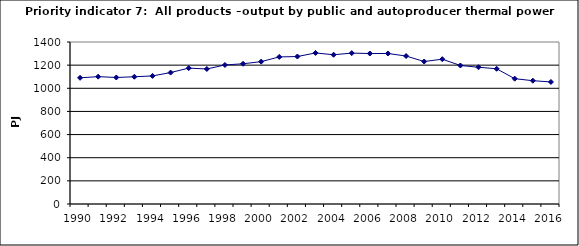
| Category | All products –output by public and autoproducer thermal power stations, PJ |
|---|---|
| 1990 | 1090.57 |
| 1991 | 1100.534 |
| 1992 | 1093.374 |
| 1993 | 1099.559 |
| 1994 | 1106.914 |
| 1995 | 1135.836 |
| 1996 | 1174.446 |
| 1997 | 1166.879 |
| 1998 | 1201.55 |
| 1999 | 1211.789 |
| 2000 | 1230.419 |
| 2001 | 1271.005 |
| 2002 | 1274.377 |
| 2003 | 1305.361 |
| 2004 | 1289.928 |
| 2005 | 1303.964 |
| 2006 | 1300.435 |
| 2007 | 1300.742 |
| 2008 | 1278.86 |
| 2009 | 1231.239 |
| 2010 | 1251.387 |
| 2011 | 1197.141 |
| 2012 | 1181.848 |
| 2013 | 1168.641 |
| 2014 | 1082.959 |
| 2015 | 1065.566 |
| 2016 | 1054.599 |